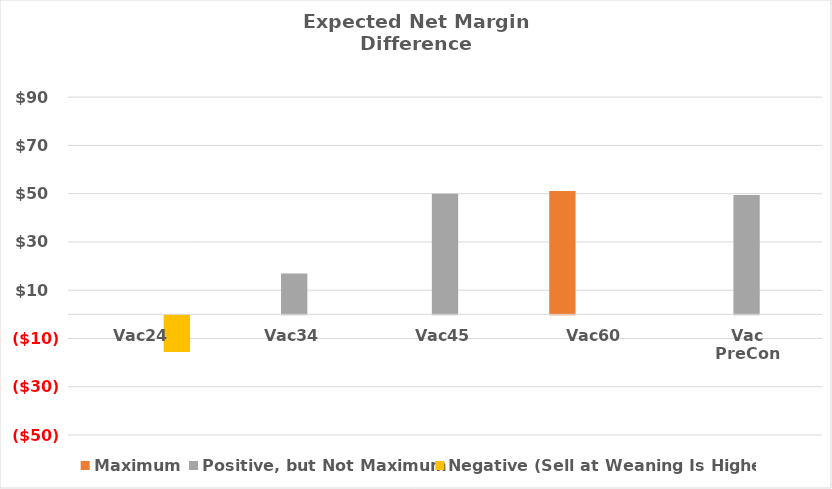
| Category | Maximum | Positive, but Not Maximum | Negative (Sell at Weaning Is Higher) |
|---|---|---|---|
| Vac24 | 0 | 0 | -15.162 |
| Vac34 | 0 | 16.944 | 0 |
| Vac45 | 0 | 50.011 | 0 |
| Vac60 | 51.145 | 0 | 0 |
| Vac PreCon | 0 | 49.496 | 0 |